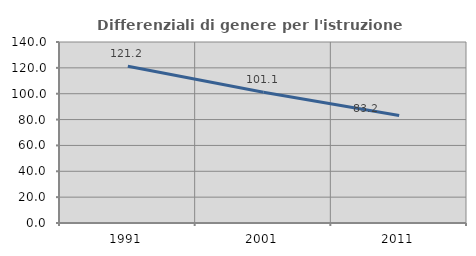
| Category | Differenziali di genere per l'istruzione superiore |
|---|---|
| 1991.0 | 121.212 |
| 2001.0 | 101.097 |
| 2011.0 | 83.17 |